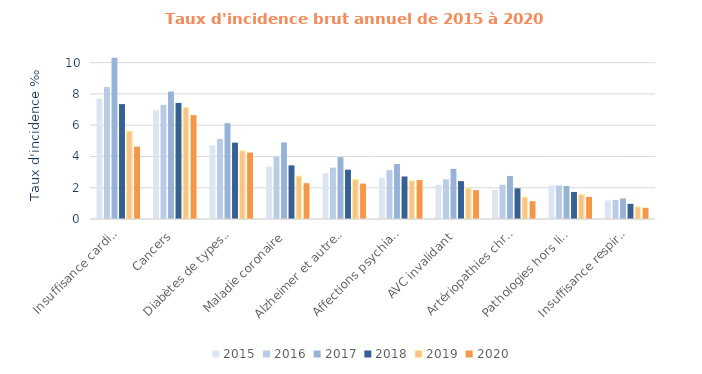
| Category | 2015 | 2016 | 2017 | 2018 | 2019 | 2020 |
|---|---|---|---|---|---|---|
| Insuffisance cardiaque grave | 7.71 | 8.445 | 10.313 | 7.347 | 5.618 | 4.63 |
| Cancers | 6.965 | 7.302 | 8.148 | 7.421 | 7.141 | 6.645 |
| Diabètes de types 1 et 2 | 4.715 | 5.117 | 6.127 | 4.883 | 4.358 | 4.246 |
| Maladie coronaire | 3.363 | 3.991 | 4.894 | 3.432 | 2.743 | 2.29 |
| Alzheimer et autres démences | 2.932 | 3.288 | 3.951 | 3.155 | 2.529 | 2.267 |
| Affections psychiatriques | 2.612 | 3.124 | 3.51 | 2.72 | 2.44 | 2.491 |
| AVC invalidant | 2.183 | 2.541 | 3.205 | 2.421 | 1.974 | 1.847 |
| Artériopathies chroniques | 1.872 | 2.19 | 2.754 | 1.964 | 1.396 | 1.139 |
| Pathologies hors liste | 2.148 | 2.143 | 2.111 | 1.73 | 1.577 | 1.416 |
| Insuffisance respiratoire | 1.182 | 1.214 | 1.317 | 0.969 | 0.773 | 0.716 |